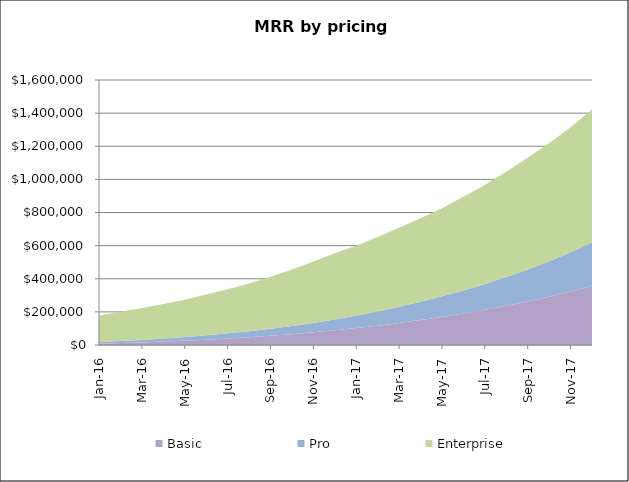
| Category | Basic | Pro | Enterprise |
|---|---|---|---|
| 2016-01-01 | 8050 | 9500 | 161000 |
| 2016-02-01 | 11607.75 | 12060 | 177000 |
| 2016-03-01 | 15756.39 | 14897.869 | 193000 |
| 2016-04-01 | 20555.271 | 18271.352 | 209000 |
| 2016-05-01 | 26013.838 | 22188.273 | 225000 |
| 2016-06-01 | 32192.889 | 26656.533 | 246000 |
| 2016-07-01 | 39154.345 | 31168.92 | 267000 |
| 2016-08-01 | 46961.258 | 36761.294 | 288000 |
| 2016-09-01 | 55729.862 | 42929.166 | 314000 |
| 2016-10-01 | 65526.298 | 49680.753 | 340000 |
| 2016-11-01 | 76470.445 | 57024.352 | 370000 |
| 2016-12-01 | 88578.791 | 65760.641 | 400000 |
| 2017-01-01 | 102080.322 | 75379.125 | 422000 |
| 2017-02-01 | 116781.64 | 86159.136 | 449500 |
| 2017-03-01 | 132806.972 | 97849.303 | 477000 |
| 2017-04-01 | 150228.974 | 110731.901 | 504500 |
| 2017-05-01 | 169175.714 | 124553.182 | 532000 |
| 2017-06-01 | 189723.198 | 139870.516 | 565000 |
| 2017-07-01 | 212112.821 | 156158.356 | 598000 |
| 2017-08-01 | 236425.666 | 173979.826 | 636000 |
| 2017-09-01 | 262744.168 | 193632.95 | 674000 |
| 2017-10-01 | 291263.18 | 215143.886 | 712000 |
| 2017-11-01 | 322292.758 | 238260.055 | 754500 |
| 2017-12-01 | 355924.532 | 263845.112 | 802000 |